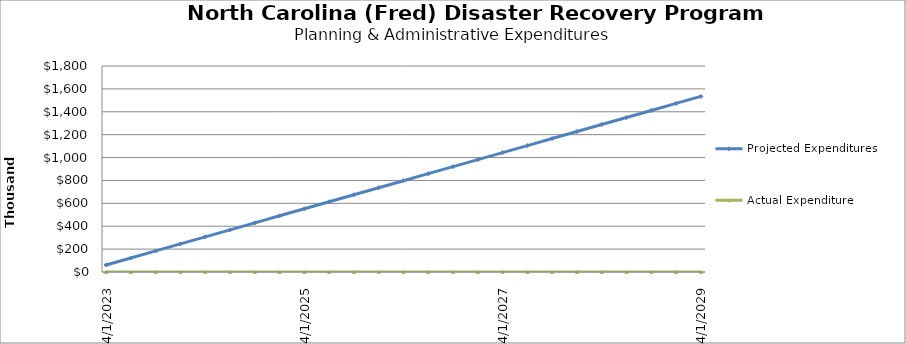
| Category | Projected Expenditures | Actual Expenditure |
|---|---|---|
| 4/1/23 | 61372 | 0 |
| 7/1/23 | 122744 | 0 |
| 10/1/23 | 184116 | 0 |
| 1/1/24 | 245488 | 0 |
| 4/1/24 | 306860 | 0 |
| 7/1/24 | 368232 | 0 |
| 10/1/24 | 429604 | 0 |
| 1/1/25 | 490976 | 0 |
| 4/1/25 | 552348 | 0 |
| 7/1/25 | 613720 | 0 |
| 10/1/25 | 675092 | 0 |
| 1/1/26 | 736464 | 0 |
| 4/1/26 | 797836 | 0 |
| 7/1/26 | 859208 | 0 |
| 10/1/26 | 920580 | 0 |
| 1/1/27 | 981952 | 0 |
| 4/1/27 | 1043324 | 0 |
| 7/1/27 | 1104696 | 0 |
| 10/1/27 | 1166068 | 0 |
| 1/1/28 | 1227440 | 0 |
| 4/1/28 | 1288812 | 0 |
| 7/1/28 | 1350184 | 0 |
| 10/1/28 | 1411556 | 0 |
| 1/1/29 | 1472928 | 0 |
| 4/1/29 | 1534300 | 0 |